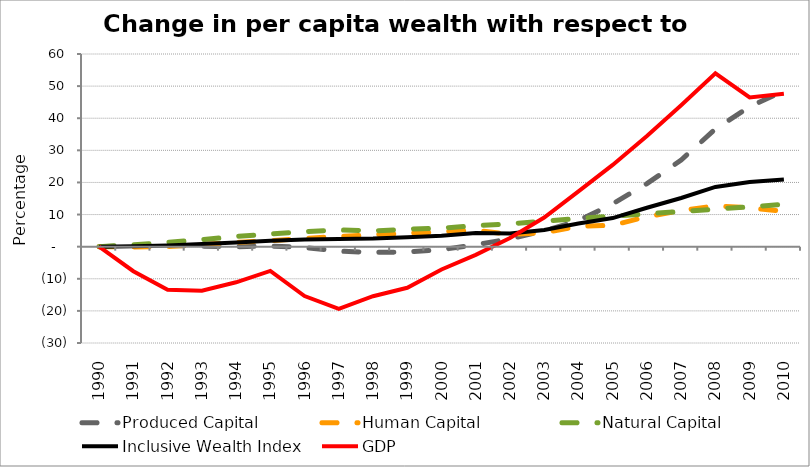
| Category | Produced Capital  | Human Capital | Natural Capital | Inclusive Wealth Index | GDP |
|---|---|---|---|---|---|
| 1990.0 | 0 | 0 | 0 | 0 | 0 |
| 1991.0 | 0.208 | -0.085 | 0.592 | 0.117 | -7.651 |
| 1992.0 | 0.381 | 0.017 | 1.326 | 0.356 | -13.44 |
| 1993.0 | 0.142 | 0.676 | 2.182 | 0.825 | -13.716 |
| 1994.0 | -0.02 | 1.321 | 3.156 | 1.327 | -11.102 |
| 1995.0 | 0.223 | 1.884 | 3.962 | 1.854 | -7.538 |
| 1996.0 | -0.291 | 2.578 | 4.643 | 2.24 | -15.38 |
| 1997.0 | -1.39 | 3.153 | 5.247 | 2.396 | -19.367 |
| 1998.0 | -1.802 | 3.671 | 4.87 | 2.51 | -15.438 |
| 1999.0 | -1.649 | 4.156 | 5.442 | 2.927 | -12.813 |
| 2000.0 | -0.931 | 4.62 | 5.764 | 3.429 | -7.12 |
| 2001.0 | 0.596 | 5.091 | 6.524 | 4.222 | -2.553 |
| 2002.0 | 2.437 | 3.788 | 7.129 | 4.075 | 2.69 |
| 2003.0 | 4.901 | 4.372 | 7.942 | 5.179 | 9.07 |
| 2004.0 | 8.117 | 6.312 | 8.768 | 7.232 | 17.191 |
| 2005.0 | 13.349 | 6.66 | 9.535 | 8.897 | 25.449 |
| 2006.0 | 19.636 | 9.334 | 10.223 | 12.112 | 34.479 |
| 2007.0 | 26.976 | 11.232 | 10.932 | 15.165 | 44.073 |
| 2008.0 | 36.647 | 12.73 | 11.682 | 18.594 | 53.978 |
| 2009.0 | 43.609 | 12.111 | 12.392 | 20.146 | 46.484 |
| 2010.0 | 48.488 | 10.969 | 13.192 | 20.895 | 47.651 |